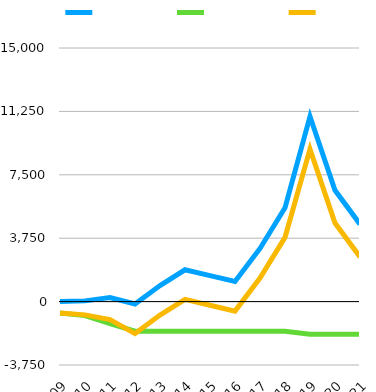
| Category | Series 0 | Series 1 | Series 2 |
|---|---|---|---|
| 2009 | -1.382 | -670.531 | -671.913 |
| 2010 | 42.799 | -827.402 | -784.603 |
| 2011 | 239.446 | -1301.341 | -1061.895 |
| 2012 | -140.654 | -1749.677 | -1890.331 |
| 2013 | 950.535 | -1749.677 | -799.142 |
| 2014 | 1881.855 | -1749.677 | 132.178 |
| 2015 | 1537.172 | -1749.677 | -212.505 |
| 2016 | 1187.907 | -1749.677 | -561.77 |
| 2017 | 3143.1 | -1749.677 | 1393.423 |
| 2018 | 5547.122 | -1749.677 | 3797.445 |
| 2019 | 10952.141 | -1936.048 | 9016.093 |
| 2020 | 6584.152 | -1936.048 | 4648.104 |
| 2021 | 4578.952 | -1936.048 | 2642.904 |